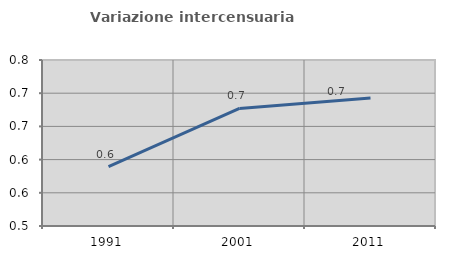
| Category | Variazione intercensuaria annua |
|---|---|
| 1991.0 | 0.589 |
| 2001.0 | 0.677 |
| 2011.0 | 0.693 |